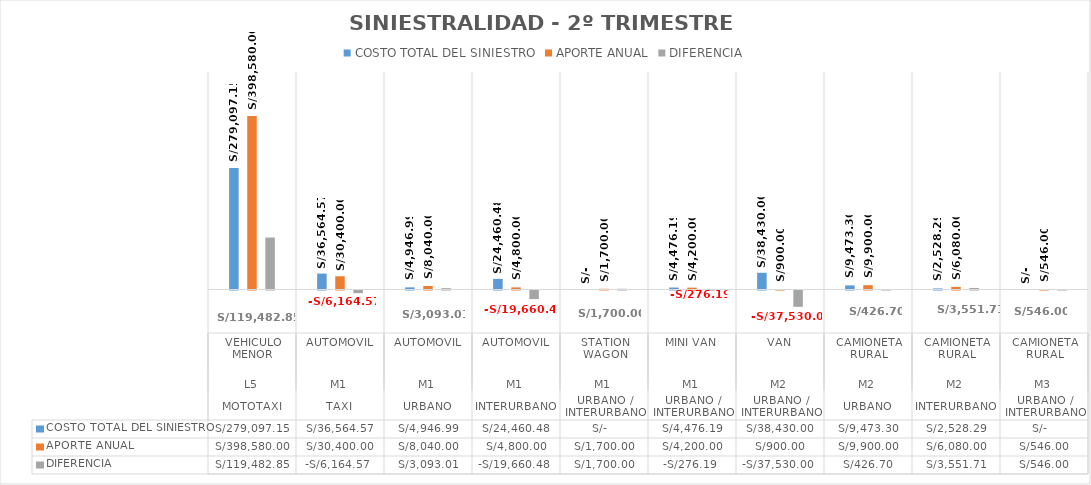
| Category | COSTO TOTAL DEL SINIESTRO | APORTE ANUAL | DIFERENCIA |
|---|---|---|---|
| 0 | 279097.15 | 398580 | 119482.85 |
| 1 | 36564.57 | 30400 | -6164.57 |
| 2 | 4946.99 | 8040 | 3093.01 |
| 3 | 24460.48 | 4800 | -19660.48 |
| 4 | 0 | 1700 | 1700 |
| 5 | 4476.19 | 4200 | -276.19 |
| 6 | 38430 | 900 | -37530 |
| 7 | 9473.3 | 9900 | 426.7 |
| 8 | 2528.29 | 6080 | 3551.71 |
| 9 | 0 | 546 | 546 |